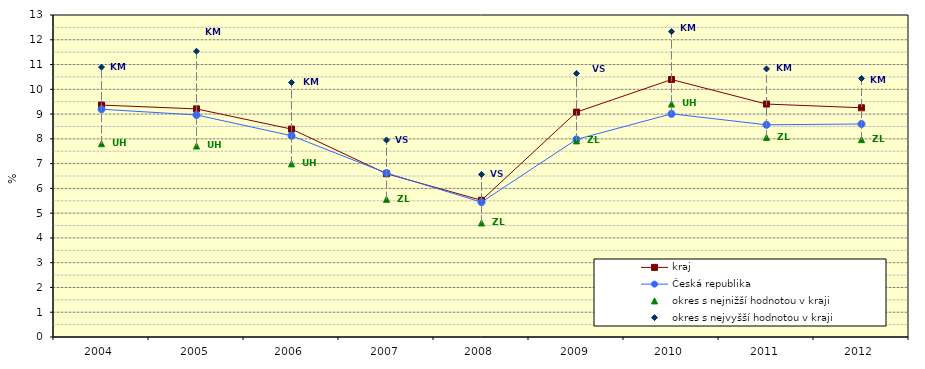
| Category | kraj | Česká republika | okres s nejnižší hodnotou v kraji | okres s nejvyšší hodnotou v kraji |
|---|---|---|---|---|
| 2004.0 | 9.364 | 9.195 | 7.804 | 10.896 |
| 2005.0 | 9.209 | 8.965 | 7.711 | 11.537 |
| 2006.0 | 8.395 | 8.126 | 6.991 | 10.274 |
| 2007.0 | 6.593 | 6.619 | 5.56 | 7.952 |
| 2008.0 | 5.52 | 5.444 | 4.605 | 6.564 |
| 2009.0 | 9.08 | 7.977 | 7.918 | 10.641 |
| 2010.0 | 10.394 | 9.009 | 9.407 | 12.332 |
| 2011.0 | 9.405 | 8.568 | 8.059 | 10.824 |
| 2012.0 | 9.254 | 8.6 | 7.969 | 10.438 |